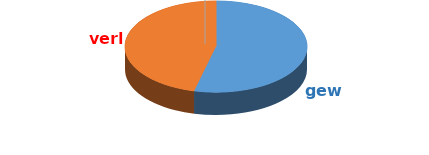
| Category | Series 0 |
|---|---|
| gew | 1093 |
| verl | 937 |